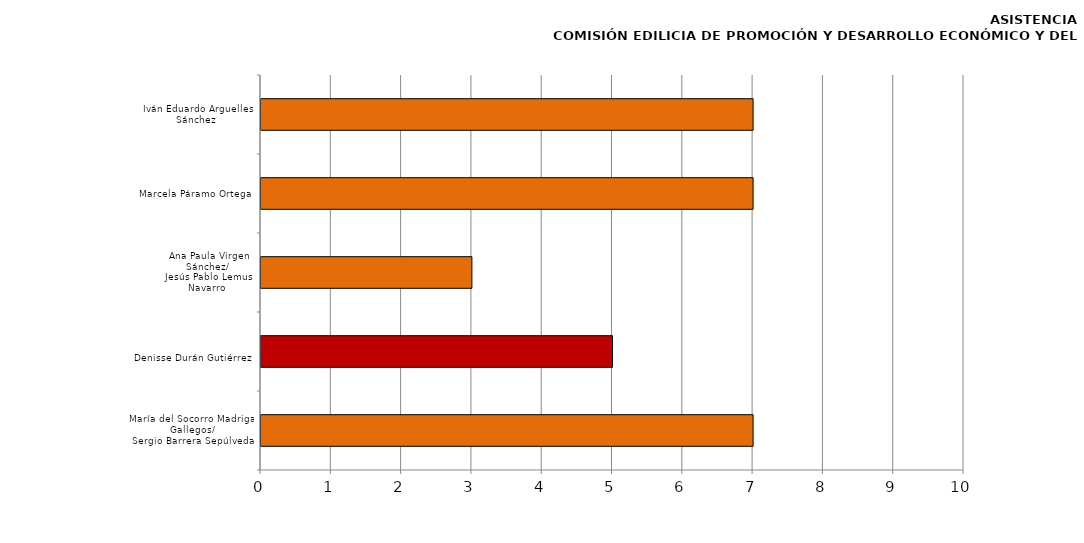
| Category | Series 0 |
|---|---|
| María del Socorro Madrigal Gallegos/
Sergio Barrera Sepúlveda | 7 |
| 
Denisse Durán Gutiérrez
 | 5 |
| Ana Paula Virgen Sánchez/ 
Jesús Pablo Lemus Navarro  | 3 |
| Marcela Páramo Ortega | 7 |
| Iván Eduardo Arguelles Sánchez  | 7 |